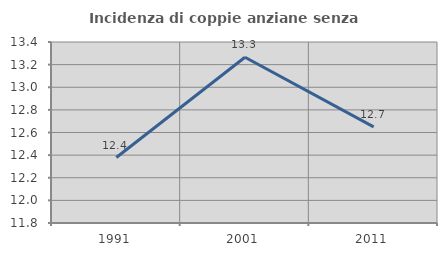
| Category | Incidenza di coppie anziane senza figli  |
|---|---|
| 1991.0 | 12.379 |
| 2001.0 | 13.265 |
| 2011.0 | 12.65 |